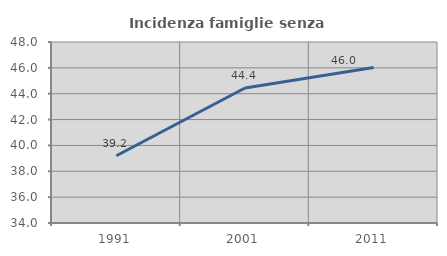
| Category | Incidenza famiglie senza nuclei |
|---|---|
| 1991.0 | 39.2 |
| 2001.0 | 44.444 |
| 2011.0 | 46.032 |